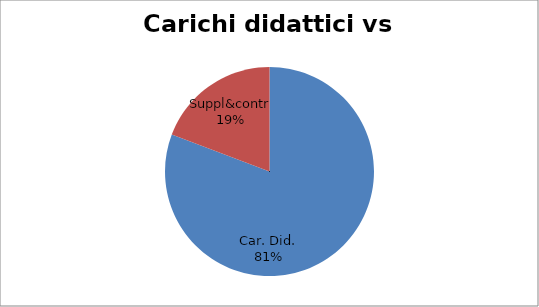
| Category | Series 0 |
|---|---|
| Car. Did. | 0.808 |
| Suppl&contr | 0.192 |